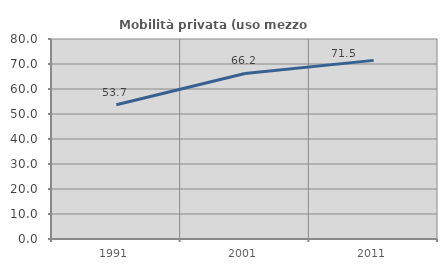
| Category | Mobilità privata (uso mezzo privato) |
|---|---|
| 1991.0 | 53.675 |
| 2001.0 | 66.224 |
| 2011.0 | 71.452 |